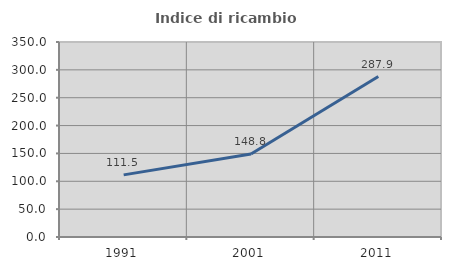
| Category | Indice di ricambio occupazionale  |
|---|---|
| 1991.0 | 111.508 |
| 2001.0 | 148.848 |
| 2011.0 | 287.919 |